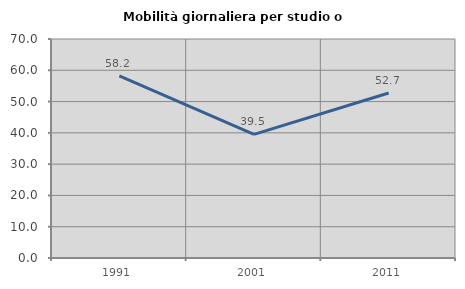
| Category | Mobilità giornaliera per studio o lavoro |
|---|---|
| 1991.0 | 58.249 |
| 2001.0 | 39.524 |
| 2011.0 | 52.727 |